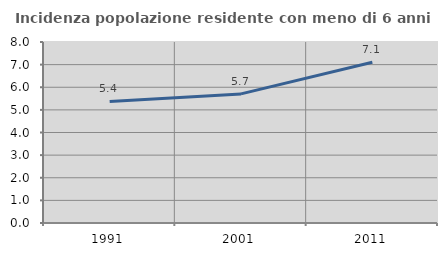
| Category | Incidenza popolazione residente con meno di 6 anni |
|---|---|
| 1991.0 | 5.373 |
| 2001.0 | 5.707 |
| 2011.0 | 7.104 |